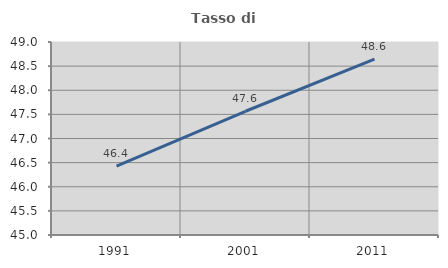
| Category | Tasso di occupazione   |
|---|---|
| 1991.0 | 46.427 |
| 2001.0 | 47.564 |
| 2011.0 | 48.645 |